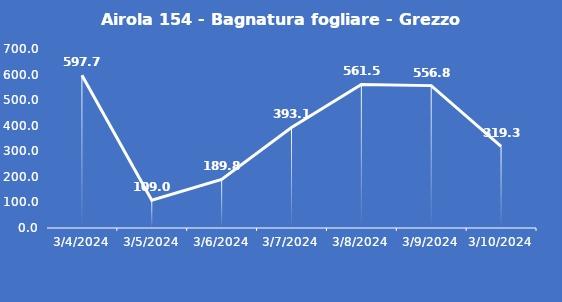
| Category | Airola 154 - Bagnatura fogliare - Grezzo (min) |
|---|---|
| 3/4/24 | 597.7 |
| 3/5/24 | 109 |
| 3/6/24 | 189.8 |
| 3/7/24 | 393.1 |
| 3/8/24 | 561.5 |
| 3/9/24 | 556.8 |
| 3/10/24 | 319.3 |